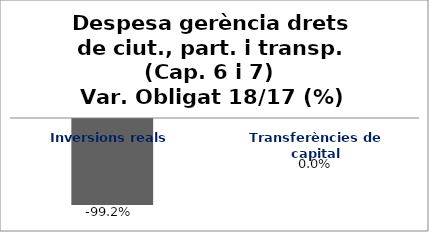
| Category | Series 0 |
|---|---|
| Inversions reals | -0.992 |
| Transferències de capital | 0 |